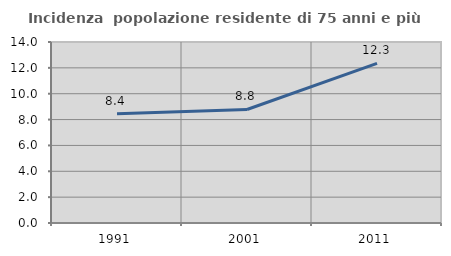
| Category | Incidenza  popolazione residente di 75 anni e più |
|---|---|
| 1991.0 | 8.445 |
| 2001.0 | 8.781 |
| 2011.0 | 12.347 |